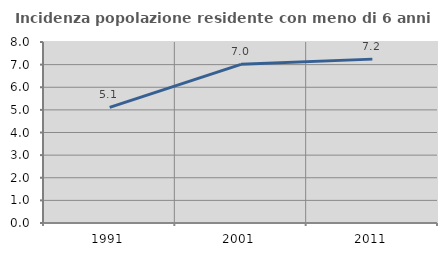
| Category | Incidenza popolazione residente con meno di 6 anni |
|---|---|
| 1991.0 | 5.114 |
| 2001.0 | 7.014 |
| 2011.0 | 7.243 |